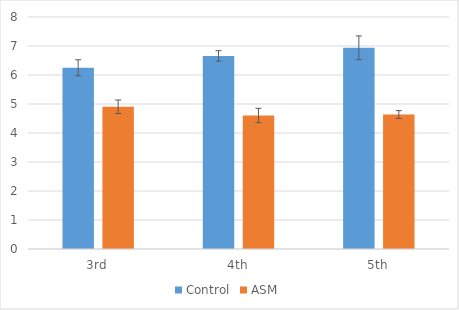
| Category | Control | ASM |
|---|---|---|
| 3rd | 6.249 | 4.905 |
| 4th | 6.659 | 4.605 |
| 5th | 6.938 | 4.637 |